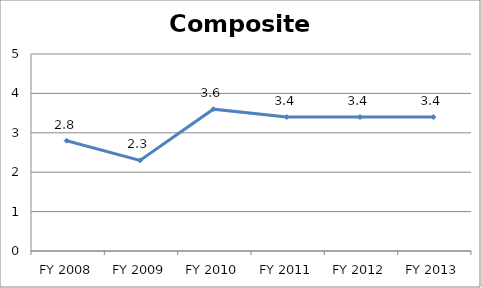
| Category | Composite score |
|---|---|
| FY 2013 | 3.4 |
| FY 2012 | 3.4 |
| FY 2011 | 3.4 |
| FY 2010 | 3.6 |
| FY 2009 | 2.3 |
| FY 2008 | 2.8 |